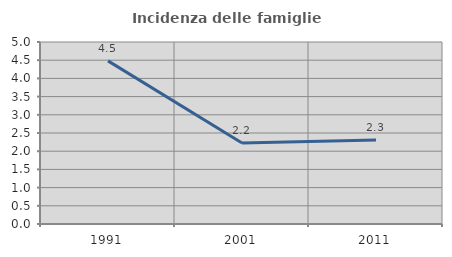
| Category | Incidenza delle famiglie numerose |
|---|---|
| 1991.0 | 4.482 |
| 2001.0 | 2.224 |
| 2011.0 | 2.308 |